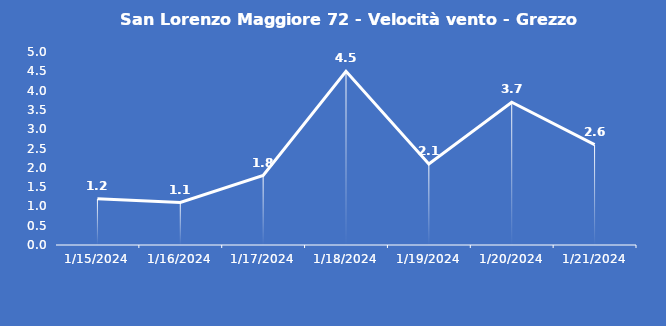
| Category | San Lorenzo Maggiore 72 - Velocità vento - Grezzo (m/s) |
|---|---|
| 1/15/24 | 1.2 |
| 1/16/24 | 1.1 |
| 1/17/24 | 1.8 |
| 1/18/24 | 4.5 |
| 1/19/24 | 2.1 |
| 1/20/24 | 3.7 |
| 1/21/24 | 2.6 |